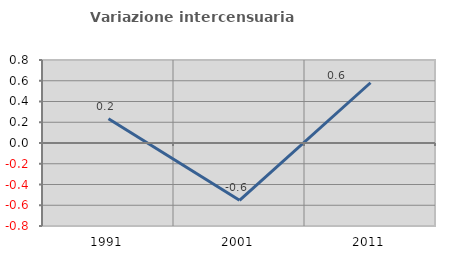
| Category | Variazione intercensuaria annua |
|---|---|
| 1991.0 | 0.234 |
| 2001.0 | -0.552 |
| 2011.0 | 0.581 |